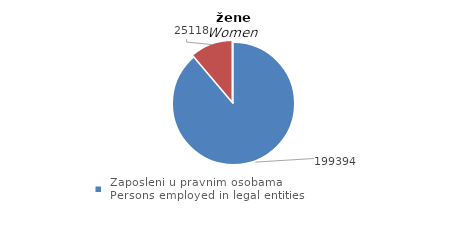
| Category | žene
Women |
|---|---|
|  Zaposleni u pravnim osobama
 Persons employed in legal entities  | 199394 |
| Zaposleni u obrtu i srodnim djelatnostima 
Persons employed in trades and related activities | 25118 |